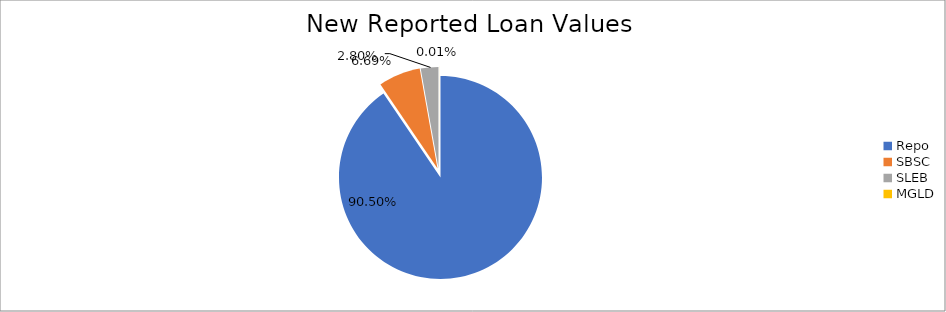
| Category | Series 0 |
|---|---|
| Repo | 12387840.313 |
| SBSC | 915214.348 |
| SLEB | 383098.79 |
| MGLD | 1517.972 |